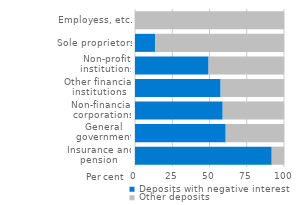
| Category | Deposits with negative interest | Other deposits |
|---|---|---|
| Insurance and pension | 91.758 | 8.242 |
| General government | 60.879 | 39.121 |
| Non-financial corporations | 58.863 | 41.137 |
| Other financial institutions | 57.463 | 42.537 |
| Non-profit institutions | 49.378 | 50.622 |
| Sole proprietors | 13.638 | 86.362 |
| Employess, etc. | 0 | 100 |